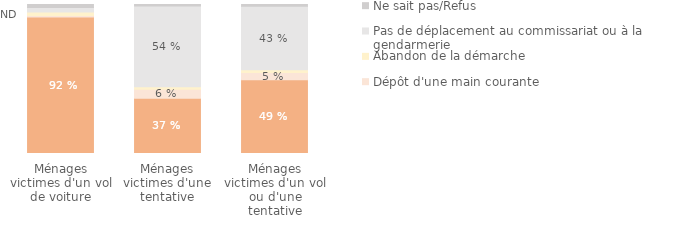
| Category | Dépôt de plainte | Dépôt d'une main courante | Abandon de la démarche | Pas de déplacement au commissariat ou à la gendarmerie | Ne sait pas/Refus |
|---|---|---|---|---|---|
| Ménages victimes d'un vol ou d'une tentative | 0.495 | 0.049 | 0.018 | 0.426 | 0.012 |
| Ménages victimes d'une tentative | 0.371 | 0.061 | 0.016 | 0.543 | 0.01 |
| Ménages victimes d'un vol de voiture | 0.916 | 0.01 | 0.024 | 0.029 | 0.02 |